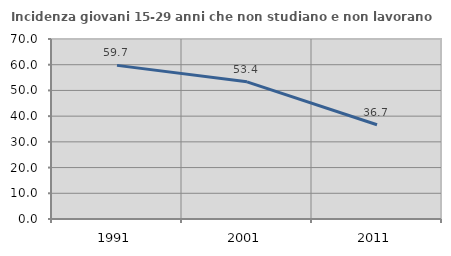
| Category | Incidenza giovani 15-29 anni che non studiano e non lavorano  |
|---|---|
| 1991.0 | 59.742 |
| 2001.0 | 53.355 |
| 2011.0 | 36.658 |